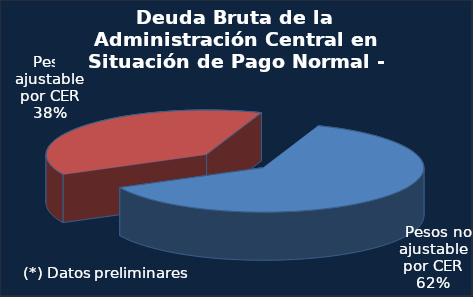
| Category | Series 0 |
|---|---|
|   Pesos no ajustable por CER | 38921.1 |
|   Pesos ajustable por CER | 23790.5 |